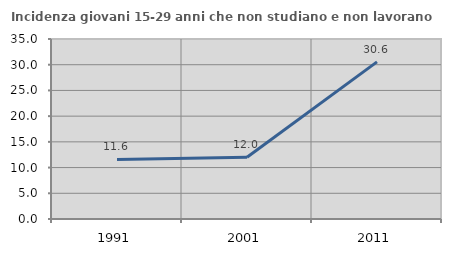
| Category | Incidenza giovani 15-29 anni che non studiano e non lavorano  |
|---|---|
| 1991.0 | 11.59 |
| 2001.0 | 12 |
| 2011.0 | 30.556 |